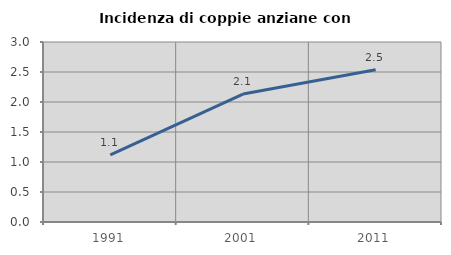
| Category | Incidenza di coppie anziane con figli |
|---|---|
| 1991.0 | 1.119 |
| 2001.0 | 2.132 |
| 2011.0 | 2.538 |